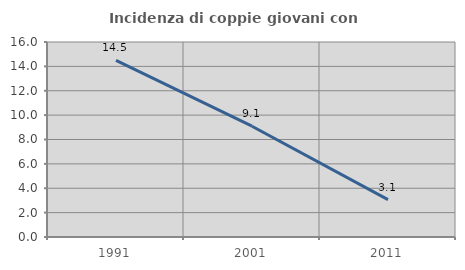
| Category | Incidenza di coppie giovani con figli |
|---|---|
| 1991.0 | 14.499 |
| 2001.0 | 9.091 |
| 2011.0 | 3.066 |